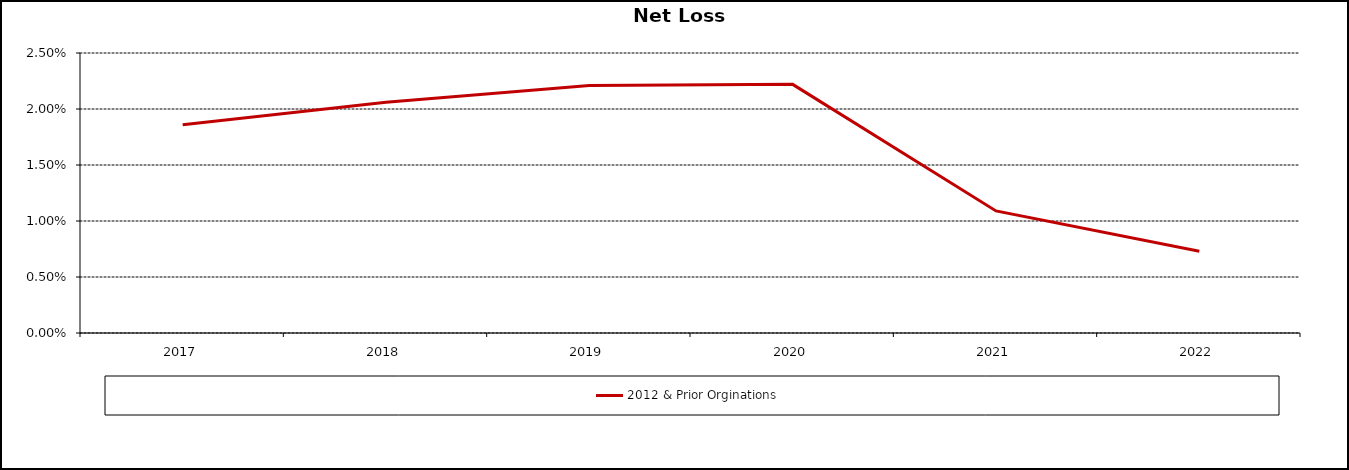
| Category | 2012 & Prior Orginations  |
|---|---|
| 2017.0 | 0.019 |
| 2018.0 | 0.021 |
| 2019.0 | 0.022 |
| 2020.0 | 0.022 |
| 2021.0 | 0.011 |
| 2022.0 | 0.007 |